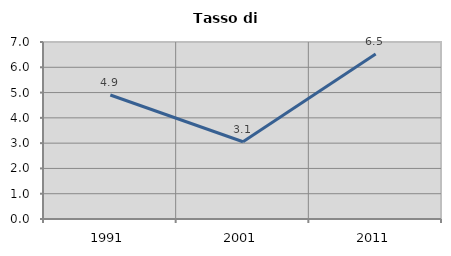
| Category | Tasso di disoccupazione   |
|---|---|
| 1991.0 | 4.904 |
| 2001.0 | 3.056 |
| 2011.0 | 6.522 |